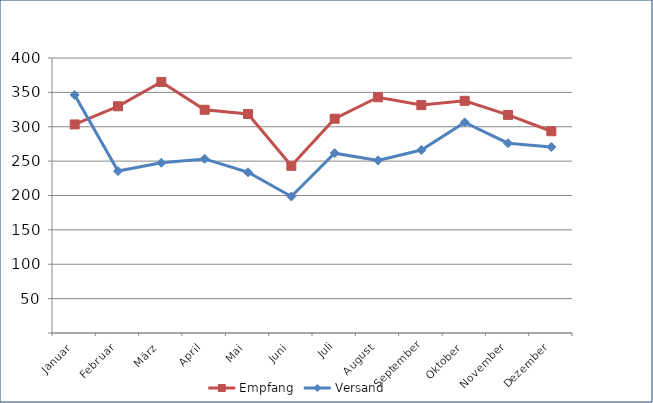
| Category | Empfang | Versand |
|---|---|---|
| Januar | 303.363 | 346.268 |
| Februar | 329.775 | 235.549 |
| März | 365.118 | 247.589 |
| April | 324.704 | 253.239 |
| Mai | 318.502 | 233.806 |
| Juni | 243.151 | 198.565 |
| Juli | 311.72 | 261.592 |
| August | 342.946 | 251.096 |
| September | 331.516 | 266.143 |
| Oktober | 337.689 | 306.32 |
| November | 317.216 | 276.113 |
| Dezember | 293.445 | 270.597 |